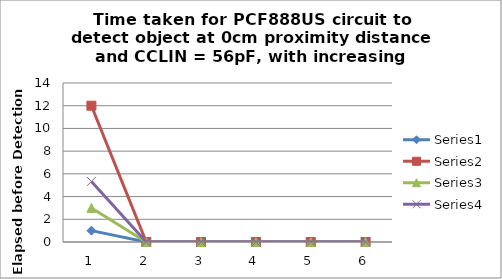
| Category | Series 0 | Series 1 | Series 2 | Series 3 |
|---|---|---|---|---|
| 0 | 1 | 12 | 3 | 5.333 |
| 1 | 0 | 0 | 0 | 0 |
| 2 | 0 | 0 | 0 | 0 |
| 3 | 0 | 0 | 0 | 0 |
| 4 | 0 | 0 | 0 | 0 |
| 5 | 0 | 0 | 0 | 0 |